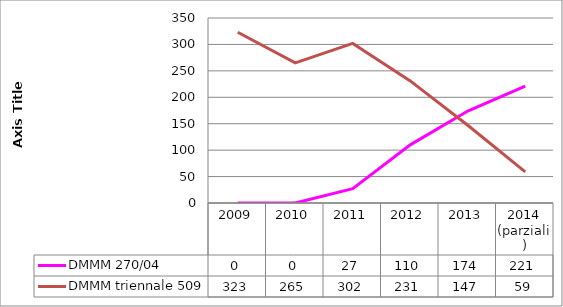
| Category | DMMM 270/04 | DMMM triennale 509 |
|---|---|---|
| 2009 | 0 | 323 |
| 2010 | 0 | 265 |
| 2011 | 27 | 302 |
| 2012 | 110 | 231 |
| 2013 | 174 | 147 |
| 2014
(parziali) | 221 | 59 |